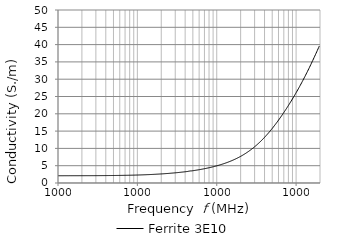
| Category | Ferrite 3E10 |
|---|---|
| 10000.0 | 2.107 |
| 10192.3 | 2.096 |
| 10388.3 | 2.097 |
| 10588.1 | 2.098 |
| 10791.8 | 2.098 |
| 10999.3 | 2.099 |
| 11210.9 | 2.099 |
| 11426.5 | 2.099 |
| 11646.2 | 2.1 |
| 11870.2 | 2.1 |
| 12098.5 | 2.101 |
| 12331.2 | 2.101 |
| 12568.4 | 2.102 |
| 12810.1 | 2.102 |
| 13056.5 | 2.103 |
| 13307.6 | 2.104 |
| 13563.5 | 2.104 |
| 13824.4 | 2.105 |
| 14090.2 | 2.105 |
| 14361.2 | 2.105 |
| 14637.4 | 2.105 |
| 14919.0 | 2.105 |
| 15205.9 | 2.106 |
| 15498.3 | 2.106 |
| 15796.4 | 2.106 |
| 16100.2 | 2.106 |
| 16409.9 | 2.106 |
| 16725.5 | 2.107 |
| 17047.1 | 2.107 |
| 17375.0 | 2.107 |
| 17709.2 | 2.107 |
| 18049.7 | 2.108 |
| 18396.9 | 2.109 |
| 18750.7 | 2.109 |
| 19111.3 | 2.11 |
| 19478.9 | 2.11 |
| 19853.5 | 2.111 |
| 20235.3 | 2.111 |
| 20624.5 | 2.112 |
| 21021.2 | 2.113 |
| 21425.5 | 2.113 |
| 21837.5 | 2.114 |
| 22257.5 | 2.114 |
| 22685.6 | 2.115 |
| 23121.9 | 2.115 |
| 23566.6 | 2.115 |
| 24019.8 | 2.116 |
| 24481.8 | 2.116 |
| 24952.6 | 2.117 |
| 25432.5 | 2.117 |
| 25921.7 | 2.118 |
| 26420.2 | 2.119 |
| 26928.3 | 2.119 |
| 27446.2 | 2.12 |
| 27974.1 | 2.121 |
| 28512.1 | 2.122 |
| 29060.5 | 2.123 |
| 29619.4 | 2.124 |
| 30189.0 | 2.125 |
| 30769.6 | 2.126 |
| 31361.4 | 2.127 |
| 31964.6 | 2.128 |
| 32579.3 | 2.129 |
| 33205.9 | 2.131 |
| 33844.5 | 2.132 |
| 34495.4 | 2.133 |
| 35158.9 | 2.134 |
| 35835.1 | 2.136 |
| 36524.3 | 2.137 |
| 37226.7 | 2.139 |
| 37942.7 | 2.14 |
| 38672.4 | 2.142 |
| 39416.2 | 2.144 |
| 40174.3 | 2.145 |
| 40946.9 | 2.147 |
| 41734.4 | 2.149 |
| 42537.1 | 2.15 |
| 43355.2 | 2.152 |
| 44189.0 | 2.154 |
| 45038.9 | 2.156 |
| 45905.1 | 2.158 |
| 46787.9 | 2.16 |
| 47687.8 | 2.162 |
| 48604.9 | 2.164 |
| 49539.7 | 2.166 |
| 50492.5 | 2.168 |
| 51463.6 | 2.171 |
| 52453.4 | 2.173 |
| 53462.2 | 2.175 |
| 54490.4 | 2.178 |
| 55538.4 | 2.18 |
| 56606.5 | 2.183 |
| 57695.2 | 2.186 |
| 58804.8 | 2.188 |
| 59935.8 | 2.191 |
| 61088.5 | 2.194 |
| 62263.4 | 2.197 |
| 63460.9 | 2.2 |
| 64681.4 | 2.203 |
| 65925.4 | 2.206 |
| 67193.3 | 2.21 |
| 68485.6 | 2.214 |
| 69802.7 | 2.217 |
| 71145.2 | 2.22 |
| 72513.5 | 2.224 |
| 73908.1 | 2.227 |
| 75329.5 | 2.231 |
| 76778.3 | 2.235 |
| 78255.0 | 2.239 |
| 79760.0 | 2.244 |
| 81294.0 | 2.248 |
| 82857.5 | 2.253 |
| 84451.0 | 2.257 |
| 86075.2 | 2.262 |
| 87730.7 | 2.266 |
| 89417.9 | 2.271 |
| 91137.7 | 2.275 |
| 92890.5 | 2.28 |
| 94677.0 | 2.286 |
| 96497.9 | 2.291 |
| 98353.8 | 2.297 |
| 100245.0 | 2.303 |
| 102173.0 | 2.309 |
| 104138.0 | 2.315 |
| 106141.0 | 2.321 |
| 108183.0 | 2.328 |
| 110263.0 | 2.335 |
| 112384.0 | 2.341 |
| 114545.0 | 2.348 |
| 116748.0 | 2.355 |
| 118994.0 | 2.362 |
| 121282.0 | 2.37 |
| 123615.0 | 2.377 |
| 125992.0 | 2.384 |
| 128415.0 | 2.392 |
| 130885.0 | 2.399 |
| 133402.0 | 2.407 |
| 135968.0 | 2.416 |
| 138583.0 | 2.424 |
| 141248.0 | 2.433 |
| 143965.0 | 2.441 |
| 146734.0 | 2.45 |
| 149556.0 | 2.459 |
| 152432.0 | 2.468 |
| 155364.0 | 2.478 |
| 158352.0 | 2.487 |
| 161397.0 | 2.497 |
| 164501.0 | 2.507 |
| 167665.0 | 2.517 |
| 170890.0 | 2.528 |
| 174176.0 | 2.539 |
| 177526.0 | 2.55 |
| 180940.0 | 2.561 |
| 184420.0 | 2.572 |
| 187967.0 | 2.583 |
| 191582.0 | 2.595 |
| 195267.0 | 2.607 |
| 199022.0 | 2.619 |
| 202850.0 | 2.631 |
| 206751.0 | 2.643 |
| 210728.0 | 2.656 |
| 214780.0 | 2.669 |
| 218911.0 | 2.683 |
| 223121.0 | 2.696 |
| 227413.0 | 2.71 |
| 231786.0 | 2.724 |
| 236244.0 | 2.739 |
| 240788.0 | 2.753 |
| 245419.0 | 2.768 |
| 250139.0 | 2.783 |
| 254949.0 | 2.798 |
| 259853.0 | 2.814 |
| 264850.0 | 2.83 |
| 269944.0 | 2.846 |
| 275136.0 | 2.863 |
| 280427.0 | 2.88 |
| 285821.0 | 2.897 |
| 291318.0 | 2.914 |
| 296920.0 | 2.932 |
| 302631.0 | 2.95 |
| 308451.0 | 2.968 |
| 314383.0 | 2.987 |
| 320430.0 | 3.006 |
| 326593.0 | 3.025 |
| 332874.0 | 3.044 |
| 339276.0 | 3.064 |
| 345801.0 | 3.084 |
| 352451.0 | 3.105 |
| 359230.0 | 3.125 |
| 366139.0 | 3.147 |
| 373181.0 | 3.168 |
| 380358.0 | 3.19 |
| 387673.0 | 3.215 |
| 395129.0 | 3.234 |
| 402728.0 | 3.257 |
| 410474.0 | 3.28 |
| 418368.0 | 3.304 |
| 426414.0 | 3.328 |
| 434615.0 | 3.352 |
| 442974.0 | 3.402 |
| 451494.0 | 3.435 |
| 460177.0 | 3.464 |
| 469027.0 | 3.49 |
| 478048.0 | 3.495 |
| 487242.0 | 3.516 |
| 496613.0 | 3.543 |
| 506164.0 | 3.572 |
| 515899.0 | 3.6 |
| 525821.0 | 3.629 |
| 535934.0 | 3.659 |
| 546241.0 | 3.689 |
| 556746.0 | 3.719 |
| 567454.0 | 3.75 |
| 578368.0 | 3.782 |
| 589491.0 | 3.813 |
| 600828.0 | 3.846 |
| 612384.0 | 3.88 |
| 624162.0 | 3.914 |
| 636166.0 | 3.948 |
| 648401.0 | 3.983 |
| 660871.0 | 4.018 |
| 673581.0 | 4.054 |
| 686536.0 | 4.091 |
| 699740.0 | 4.128 |
| 713198.0 | 4.166 |
| 726914.0 | 4.204 |
| 740894.0 | 4.244 |
| 755144.0 | 4.284 |
| 769667.0 | 4.324 |
| 784470.0 | 4.366 |
| 799557.0 | 4.407 |
| 814934.0 | 4.45 |
| 830608.0 | 4.494 |
| 846582.0 | 4.538 |
| 862864.0 | 4.583 |
| 879459.0 | 4.629 |
| 896373.0 | 4.676 |
| 913613.0 | 4.723 |
| 931184.0 | 4.771 |
| 949093.0 | 4.821 |
| 967346.0 | 4.871 |
| 985951.0 | 4.922 |
| 1004910.0 | 4.977 |
| 1024240.0 | 5.031 |
| 1043940.0 | 5.085 |
| 1064020.0 | 5.14 |
| 1084480.0 | 5.196 |
| 1105340.0 | 5.253 |
| 1126600.0 | 5.312 |
| 1148260.0 | 5.371 |
| 1170350.0 | 5.432 |
| 1192860.0 | 5.493 |
| 1215800.0 | 5.555 |
| 1239180.0 | 5.619 |
| 1263010.0 | 5.684 |
| 1287300.0 | 5.75 |
| 1312060.0 | 5.818 |
| 1337300.0 | 5.887 |
| 1363010.0 | 5.956 |
| 1389230.0 | 6.029 |
| 1415950.0 | 6.102 |
| 1443180.0 | 6.176 |
| 1470940.0 | 6.252 |
| 1499230.0 | 6.329 |
| 1528060.0 | 6.408 |
| 1557450.0 | 6.488 |
| 1587400.0 | 6.569 |
| 1617930.0 | 6.653 |
| 1649050.0 | 6.737 |
| 1680760.0 | 6.824 |
| 1713090.0 | 6.913 |
| 1746040.0 | 7.003 |
| 1779620.0 | 7.095 |
| 1813840.0 | 7.189 |
| 1848730.0 | 7.285 |
| 1884280.0 | 7.382 |
| 1920520.0 | 7.481 |
| 1957460.0 | 7.582 |
| 1995110.0 | 7.686 |
| 2033480.0 | 7.79 |
| 2072580.0 | 7.898 |
| 2112450.0 | 8.009 |
| 2153070.0 | 8.124 |
| 2194480.0 | 8.239 |
| 2236690.0 | 8.356 |
| 2279700.0 | 8.475 |
| 2323550.0 | 8.597 |
| 2368240.0 | 8.721 |
| 2413780.0 | 8.848 |
| 2460210.0 | 8.976 |
| 2507520.0 | 9.106 |
| 2555750.0 | 9.24 |
| 2604900.0 | 9.376 |
| 2655000.0 | 9.515 |
| 2706060.0 | 9.657 |
| 2758110.0 | 9.8 |
| 2811150.0 | 9.946 |
| 2865220.0 | 10.092 |
| 2920320.0 | 10.24 |
| 2976490.0 | 10.397 |
| 3033730.0 | 10.562 |
| 3092080.0 | 10.723 |
| 3151550.0 | 10.887 |
| 3212160.0 | 11.054 |
| 3273940.0 | 11.223 |
| 3336900.0 | 11.395 |
| 3401080.0 | 11.57 |
| 3466490.0 | 11.748 |
| 3533160.0 | 11.928 |
| 3601110.0 | 12.112 |
| 3670370.0 | 12.299 |
| 3740960.0 | 12.495 |
| 3812910.0 | 12.689 |
| 3886240.0 | 12.889 |
| 3960980.0 | 13.088 |
| 4037160.0 | 13.29 |
| 4114810.0 | 13.497 |
| 4193950.0 | 13.706 |
| 4274610.0 | 13.915 |
| 4356820.0 | 14.13 |
| 4440610.0 | 14.346 |
| 4526010.0 | 14.566 |
| 4613060.0 | 14.789 |
| 4701780.0 | 15.014 |
| 4792210.0 | 15.245 |
| 4884370.0 | 15.476 |
| 4978310.0 | 15.71 |
| 5074060.0 | 15.948 |
| 5171640.0 | 16.191 |
| 5271110.0 | 16.434 |
| 5372480.0 | 16.679 |
| 5475810.0 | 16.928 |
| 5581120.0 | 17.18 |
| 5688460.0 | 17.434 |
| 5797870.0 | 17.69 |
| 5909370.0 | 17.949 |
| 6023030.0 | 18.211 |
| 6138860.0 | 18.475 |
| 6256930.0 | 18.742 |
| 6377270.0 | 19.009 |
| 6499920.0 | 19.279 |
| 6624930.0 | 19.556 |
| 6752340.0 | 19.834 |
| 6882200.0 | 20.121 |
| 7014570.0 | 20.405 |
| 7149470.0 | 20.684 |
| 7286980.0 | 20.968 |
| 7427120.0 | 21.257 |
| 7569960.0 | 21.548 |
| 7715550.0 | 21.84 |
| 7863940.0 | 22.135 |
| 8015190.0 | 22.434 |
| 8169340.0 | 22.735 |
| 8326450.0 | 23.038 |
| 8486590.0 | 23.345 |
| 8649810.0 | 23.653 |
| 8816170.0 | 23.966 |
| 8985730.0 | 24.278 |
| 9158540.0 | 24.596 |
| 9334690.0 | 24.914 |
| 9514210.0 | 25.237 |
| 9697200.0 | 25.561 |
| 9883700.0 | 25.888 |
| 10073800.0 | 26.217 |
| 10267500.0 | 26.551 |
| 10465000.0 | 26.887 |
| 10666300.0 | 27.225 |
| 10871400.0 | 27.563 |
| 11080500.0 | 27.907 |
| 11293600.0 | 28.257 |
| 11510800.0 | 28.608 |
| 11732200.0 | 28.959 |
| 11957800.0 | 29.315 |
| 12187800.0 | 29.675 |
| 12422200.0 | 30.04 |
| 12661100.0 | 30.403 |
| 12904600.0 | 30.771 |
| 13152800.0 | 31.142 |
| 13405800.0 | 31.517 |
| 13663600.0 | 31.895 |
| 13926400.0 | 32.273 |
| 14194200.0 | 32.655 |
| 14467200.0 | 33.042 |
| 14745400.0 | 33.423 |
| 15029000.0 | 33.82 |
| 15318100.0 | 34.219 |
| 15612700.0 | 34.624 |
| 15913000.0 | 35.027 |
| 16219000.0 | 35.432 |
| 16530900.0 | 35.837 |
| 16848900.0 | 36.246 |
| 17172900.0 | 36.657 |
| 17503200.0 | 37.073 |
| 17839800.0 | 37.49 |
| 18182900.0 | 37.906 |
| 18532600.0 | 38.326 |
| 18889100.0 | 38.747 |
| 19252300.0 | 39.176 |
| 19622600.0 | 39.604 |